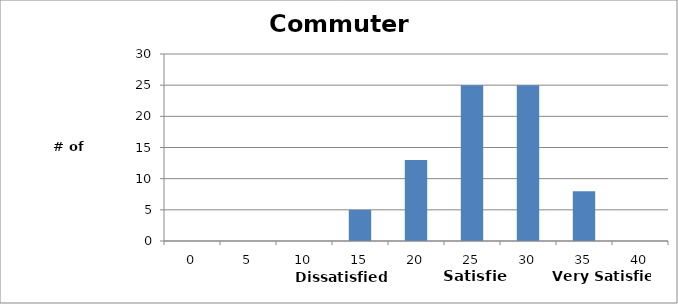
| Category | Series 0 |
|---|---|
| 0.0 | 0 |
| 5.0 | 0 |
| 10.0 | 0 |
| 15.0 | 5 |
| 20.0 | 13 |
| 25.0 | 25 |
| 30.0 | 25 |
| 35.0 | 8 |
| 40.0 | 0 |